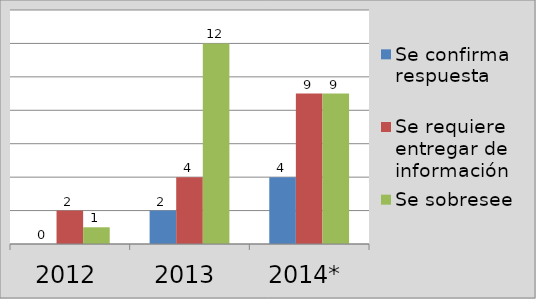
| Category | Se confirma respuesta | Se requiere entregar de información  | Se sobresee  |
|---|---|---|---|
| 2012 | 0 | 2 | 1 |
| 2013 | 2 | 4 | 12 |
| 2014* | 4 | 9 | 9 |